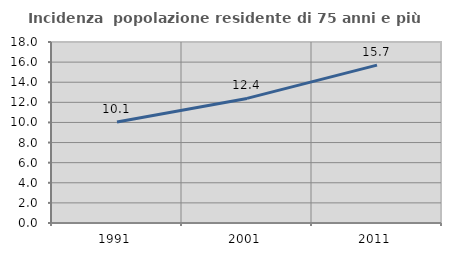
| Category | Incidenza  popolazione residente di 75 anni e più |
|---|---|
| 1991.0 | 10.052 |
| 2001.0 | 12.389 |
| 2011.0 | 15.702 |